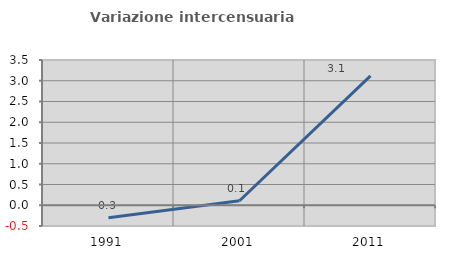
| Category | Variazione intercensuaria annua |
|---|---|
| 1991.0 | -0.302 |
| 2001.0 | 0.108 |
| 2011.0 | 3.118 |